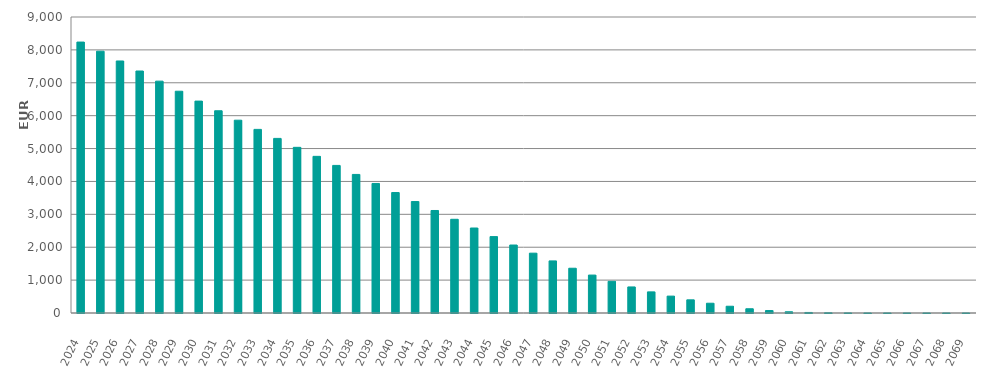
| Category | EUR Millions |
|---|---|
| 2024.0 | 8237935715.39 |
| 2025.0 | 7960054798.523 |
| 2026.0 | 7662907039.976 |
| 2027.0 | 7357827209.04 |
| 2028.0 | 7049518591.431 |
| 2029.0 | 6743158634.311 |
| 2030.0 | 6443015090.942 |
| 2031.0 | 6149352601.383 |
| 2032.0 | 5862169648.337 |
| 2033.0 | 5582921949.205 |
| 2034.0 | 5308920809.292 |
| 2035.0 | 5037138004.675 |
| 2036.0 | 4762999449.178 |
| 2037.0 | 4487553678.715 |
| 2038.0 | 4213253121.557 |
| 2039.0 | 3938817050.52 |
| 2040.0 | 3662768596.417 |
| 2041.0 | 3388686339.799 |
| 2042.0 | 3116930182.672 |
| 2043.0 | 2849111043.406 |
| 2044.0 | 2584110165.891 |
| 2045.0 | 2322752817.529 |
| 2046.0 | 2066844972.486 |
| 2047.0 | 1819357457.841 |
| 2048.0 | 1583468403.284 |
| 2049.0 | 1361036079.288 |
| 2050.0 | 1153057079.82 |
| 2051.0 | 962963128.386 |
| 2052.0 | 792287322.463 |
| 2053.0 | 642035182.889 |
| 2054.0 | 513371591.997 |
| 2055.0 | 400355779.133 |
| 2056.0 | 297220503.912 |
| 2057.0 | 205285927.376 |
| 2058.0 | 129073960.379 |
| 2059.0 | 74210383.267 |
| 2060.0 | 37205708.367 |
| 2061.0 | 16238701.259 |
| 2062.0 | 5927829.146 |
| 2063.0 | 1499935.912 |
| 2064.0 | 77877.813 |
| 2065.0 | 37172.905 |
| 2066.0 | 17259.902 |
| 2067.0 | 9841.474 |
| 2068.0 | 4547.165 |
| 2069.0 | 0 |